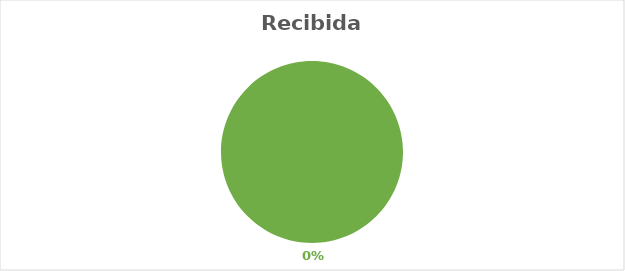
| Category | 0 Atendidas |
|---|---|
| TOTAL | 3 |